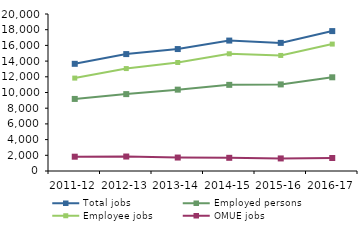
| Category | Total jobs | Employed persons | Employee jobs | OMUE jobs |
|---|---|---|---|---|
| 2011-12 | 13654 | 9181 | 11834 | 1822 |
| 2012-13 | 14893 | 9794 | 13049 | 1844 |
| 2013-14 | 15535 | 10363 | 13822 | 1714 |
| 2014-15 | 16614 | 10974 | 14933 | 1680 |
| 2015-16 | 16321 | 11031 | 14721 | 1601 |
| 2016-17 | 17822 | 11937 | 16167 | 1655 |